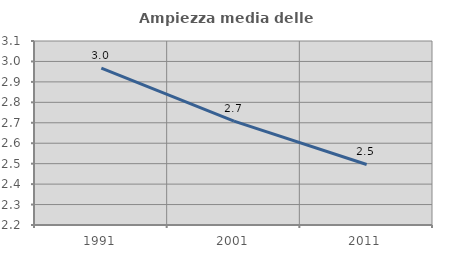
| Category | Ampiezza media delle famiglie |
|---|---|
| 1991.0 | 2.967 |
| 2001.0 | 2.708 |
| 2011.0 | 2.496 |